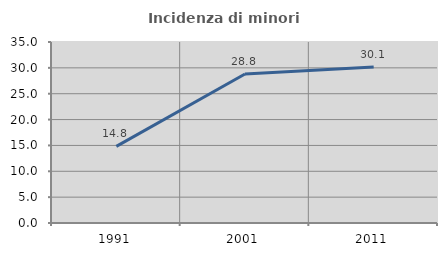
| Category | Incidenza di minori stranieri |
|---|---|
| 1991.0 | 14.815 |
| 2001.0 | 28.8 |
| 2011.0 | 30.147 |